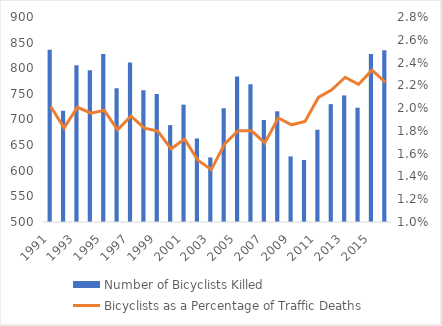
| Category | Number of Bicyclists Killed |
|---|---|
| 1991.0 | 836 |
| 1992.0 | 717 |
| 1993.0 | 806 |
| 1994.0 | 796 |
| 1995.0 | 828 |
| 1996.0 | 761 |
| 1997.0 | 811 |
| 1998.0 | 757 |
| 1999.0 | 750 |
| 2000.0 | 689 |
| 2001.0 | 729 |
| 2002.0 | 663 |
| 2003.0 | 626 |
| 2004.0 | 722 |
| 2005.0 | 784 |
| 2006.0 | 769 |
| 2007.0 | 699 |
| 2008.0 | 716 |
| 2009.0 | 628 |
| 2010.0 | 621 |
| 2011.0 | 680 |
| 2012.0 | 730 |
| 2013.0 | 747 |
| 2014.0 | 723 |
| 2015.0 | 828 |
| 2016.0 | 835 |